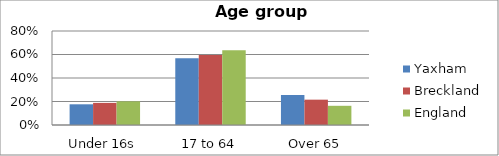
| Category | Yaxham | Breckland | England |
|---|---|---|---|
| Under 16s | 0.176 | 0.188 | 0.201 |
| 17 to 64 | 0.569 | 0.596 | 0.635 |
| Over 65 | 0.255 | 0.216 | 0.163 |